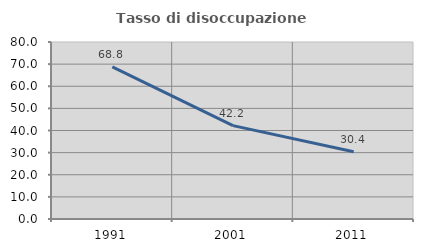
| Category | Tasso di disoccupazione giovanile  |
|---|---|
| 1991.0 | 68.75 |
| 2001.0 | 42.202 |
| 2011.0 | 30.4 |